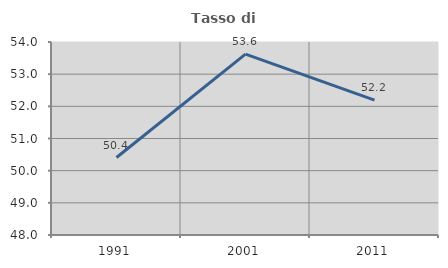
| Category | Tasso di occupazione   |
|---|---|
| 1991.0 | 50.409 |
| 2001.0 | 53.622 |
| 2011.0 | 52.192 |